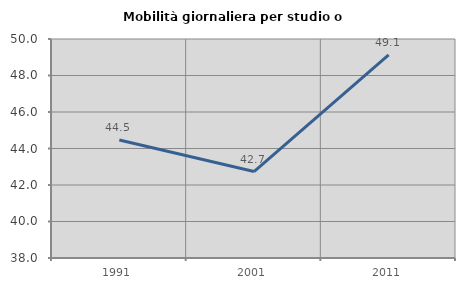
| Category | Mobilità giornaliera per studio o lavoro |
|---|---|
| 1991.0 | 44.466 |
| 2001.0 | 42.737 |
| 2011.0 | 49.124 |